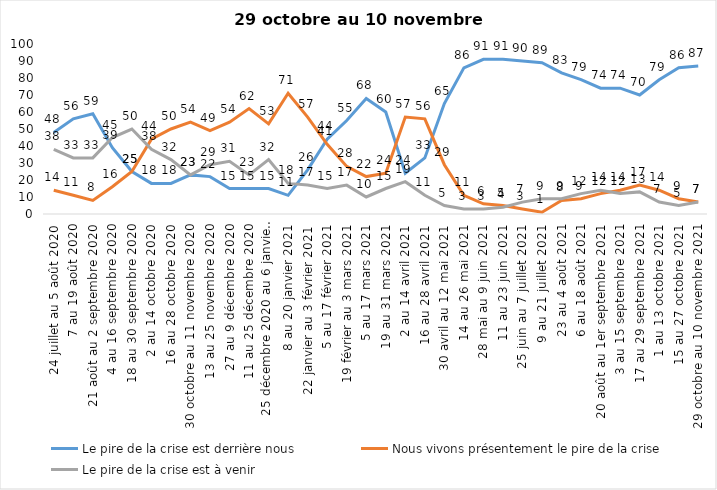
| Category | Le pire de la crise est derrière nous | Nous vivons présentement le pire de la crise | Le pire de la crise est à venir |
|---|---|---|---|
| 24 juillet au 5 août 2020 | 48 | 14 | 38 |
| 7 au 19 août 2020 | 56 | 11 | 33 |
| 21 août au 2 septembre 2020 | 59 | 8 | 33 |
| 4 au 16 septembre 2020 | 39 | 16 | 45 |
| 18 au 30 septembre 2020 | 25 | 25 | 50 |
| 2 au 14 octobre 2020 | 18 | 44 | 38 |
| 16 au 28 octobre 2020 | 18 | 50 | 32 |
| 30 octobre au 11 novembre 2020 | 23 | 54 | 23 |
| 13 au 25 novembre 2020 | 22 | 49 | 29 |
| 27 au 9 décembre 2020 | 15 | 54 | 31 |
| 11 au 25 décembre 2020 | 15 | 62 | 23 |
| 25 décembre 2020 au 6 janvier 2021 | 15 | 53 | 32 |
| 8 au 20 janvier 2021 | 11 | 71 | 18 |
| 22 janvier au 3 février 2021 | 26 | 57 | 17 |
| 5 au 17 février 2021 | 44 | 41 | 15 |
| 19 février au 3 mars 2021 | 55 | 28 | 17 |
| 5 au 17 mars 2021 | 68 | 22 | 10 |
| 19 au 31 mars 2021 | 60 | 24 | 15 |
| 2 au 14 avril 2021 | 24 | 57 | 19 |
| 16 au 28 avril 2021 | 33 | 56 | 11 |
| 30 avril au 12 mai 2021 | 65 | 29 | 5 |
| 14 au 26 mai 2021 | 86 | 11 | 3 |
| 28 mai au 9 juin 2021 | 91 | 6 | 3 |
| 11 au 23 juin 2021 | 91 | 5 | 4 |
| 25 juin au 7 juillet 2021 | 90 | 3 | 7 |
| 9 au 21 juillet 2021 | 89 | 1 | 9 |
| 23 au 4 août 2021 | 83 | 8 | 9 |
| 6 au 18 août 2021 | 79 | 9 | 12 |
| 20 août au 1er septembre 2021 | 74 | 12 | 14 |
| 3 au 15 septembre 2021 | 74 | 14 | 12 |
| 17 au 29 septembre 2021 | 70 | 17 | 13 |
| 1 au 13 octobre 2021 | 79 | 14 | 7 |
| 15 au 27 octobre 2021 | 86 | 9 | 5 |
| 29 octobre au 10 novembre 2021 | 87 | 7 | 7 |